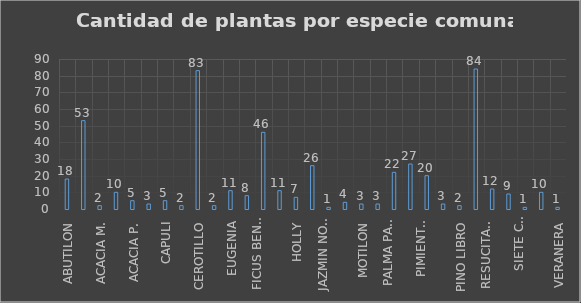
| Category | Series 0 |
|---|---|
| ABUTILON | 18 |
| ACACIA A. | 53 |
| ACACIA M. | 2 |
| ACACIA J. | 10 |
| ACACIA P. | 5 |
| ALCAPARRO | 3 |
| CAPULI | 5 |
| CAUCHO SABANERO | 2 |
| CEROTILLO | 83 |
| EUCALIPTO | 2 |
| EUGENIA | 11 |
| FALSO PIMIENTO | 8 |
| FICUS BENJAMINA | 46 |
| GUSANILLO | 11 |
| HOLLY | 7 |
| JAZMIN | 26 |
| JAZMIN NOCTURNO | 1 |
| MERMELADA | 4 |
| MOTILON | 3 |
| NISPERO DEL JAPON | 3 |
| PALMA PAYANESA | 22 |
| PALMA YUCA | 27 |
| PIMIENTO ROSADO  | 20 |
| PINO | 3 |
| PINO LIBRO | 2 |
| QUILLOTOCTO | 84 |
| RESUCITADO | 12 |
| SAUCO | 9 |
| SIETE CUEROS | 1 |
| URAPAN | 10 |
| VERANERA | 1 |